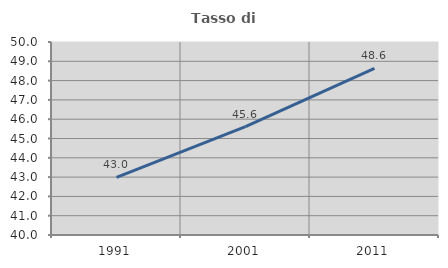
| Category | Tasso di occupazione   |
|---|---|
| 1991.0 | 42.982 |
| 2001.0 | 45.619 |
| 2011.0 | 48.638 |